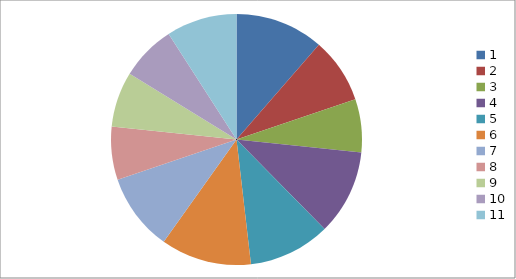
| Category | Series 0 |
|---|---|
| 0 | 20 |
| 1 | 14.75 |
| 2 | 12 |
| 3 | 19.25 |
| 4 | 18.5 |
| 5 | 20.5 |
| 6 | 17.5 |
| 7 | 12 |
| 8 | 12.5 |
| 9 | 12.5 |
| 10 | 15.95 |